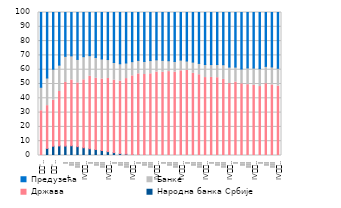
| Category | Народна банка Србије | Држава | Банке | Предузећа |
|---|---|---|---|---|
| 
'08. | 0 | 31.291 | 16.447 | 52.262 |
|  | 4.984 | 29.887 | 19.325 | 45.804 |
| 
'10. | 6.503 | 32.179 | 21.652 | 39.665 |
|  | 6.706 | 38.066 | 18.448 | 36.78 |
| I | 6.602 | 44.49 | 18.27 | 37.24 |
| II | 6.814 | 45.988 | 16.883 | 37.129 |
| III | 6.204 | 44.539 | 16.474 | 38.987 |
| IV
2012. | 5.415 | 47.513 | 16.181 | 36.306 |
| I | 4.685 | 50.704 | 14.432 | 34.864 |
| II | 4.172 | 49.857 | 14.545 | 35.598 |
| III | 3.477 | 49.994 | 14.026 | 35.98 |
| IV
2013. | 2.719 | 51.16 | 13.222 | 35.619 |
| I | 2.021 | 50.682 | 12.328 | 36.99 |
| II | 1.323 | 50.706 | 12.132 | 37.162 |
| III | 0.944 | 52.836 | 10.911 | 36.253 |
| IV
2014. | 0.591 | 55.084 | 9.967 | 34.949 |
| I | 0.407 | 56.68 | 9.408 | 33.912 |
| II | 0.194 | 56.455 | 9.127 | 34.418 |
| III | 0.112 | 57.02 | 9.265 | 33.715 |
| IV
2015. | 0.056 | 58.303 | 8.549 | 33.148 |
| I | 0.028 | 58.15 | 8.368 | 33.482 |
| II | 0 | 58.669 | 7.611 | 33.72 |
| III | 0 | 58.285 | 7.49 | 34.225 |
| IV
2016. | 0 | 59.181 | 7.541 | 33.278 |
| I | 0 | 59.444 | 6.621 | 33.935 |
| II | 0 | 57.482 | 7.844 | 34.674 |
| III | 0 | 56.477 | 7.915 | 35.608 |
| IV
2017. | 0 | 54.493 | 9.15 | 36.357 |
| I | 0 | 54.595 | 8.998 | 36.407 |
| II | 0 | 54.412 | 9.222 | 36.366 |
| III | 0 | 53.196 | 10.29 | 36.514 |
| IV
2018. | 0 | 50.351 | 11.489 | 38.16 |
| I | 0 | 51.317 | 10.529 | 38.154 |
| II | 0 | 50.105 | 10.35 | 39.545 |
| III | 0 | 49.556 | 11.696 | 38.748 |
| IV
2019. | 0 | 49.078 | 12.048 | 38.874 |
| I | 0 | 48.221 | 12.471 | 39.308 |
| II | 0 | 50.217 | 12.119 | 37.664 |
| III | 0 | 49.332 | 12.616 | 38.052 |
| IV
2020. | 0 | 48.562 | 12.433 | 39.005 |